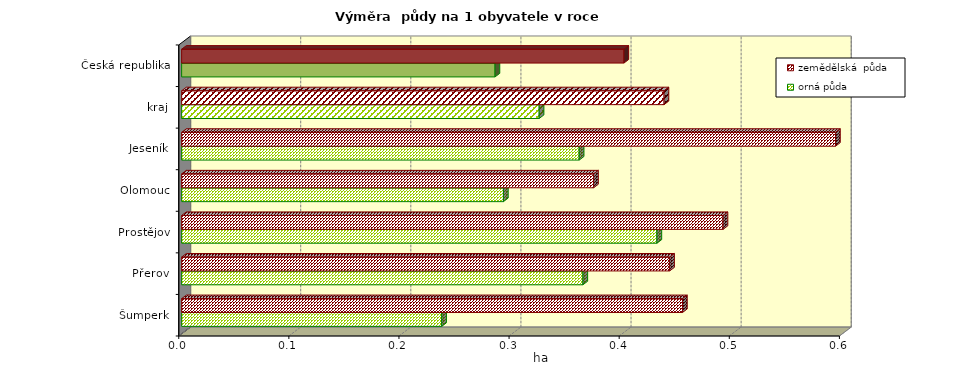
| Category | orná půda | zemědělská  půda |
|---|---|---|
| Šumperk | 0.236 | 0.455 |
| Přerov | 0.364 | 0.443 |
| Prostějov | 0.432 | 0.492 |
| Olomouc | 0.292 | 0.374 |
| Jeseník | 0.361 | 0.594 |
| kraj | 0.325 | 0.438 |
| Česká republika | 0.285 | 0.402 |